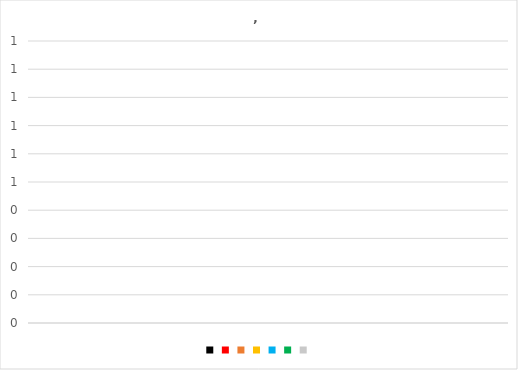
| Category | Series 0 | Series 1 | Series 2 | Series 3 | Series 4 | Series 5 | Series 6 |
|---|---|---|---|---|---|---|---|
| 0 | 0 | 0 | 0 | 0 | 0 | 0 | 0 |
| 1 | 0 | 0 | 0 | 0 | 0 | 0 | 0 |